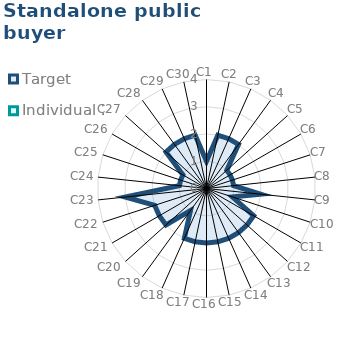
| Category | Target | Individual 2 |
|---|---|---|
| C1 | 1 | 0 |
| C2 | 2 | 0 |
| C3 | 2 | 0 |
| C4 | 2 | 0 |
| C5 | 1 | 0 |
| C6 | 1 | 0 |
| C7 | 1 | 0 |
| C8 | 1 | 0 |
| C9 | 2 | 0 |
| C10 | 1 | 0 |
| C11 | 2 | 0 |
| C12 | 2 | 0 |
| C13 | 2 | 0 |
| C14 | 2 | 0 |
| C15 | 2 | 0 |
| C16 | 2 | 0 |
| C17 | 2 | 0 |
| C18 | 2 | 0 |
| C19 | 1 | 0 |
| C20 | 2 | 0 |
| C21 | 2 | 0 |
| C22 | 2 | 0 |
| C23 | 3 | 0 |
| C24 | 1 | 0 |
| C25 | 1 | 0 |
| C26 | 1 | 0 |
| C27 | 2 | 0 |
| C28 | 2 | 0 |
| C29 | 2 | 0 |
| C30 | 2 | 0 |